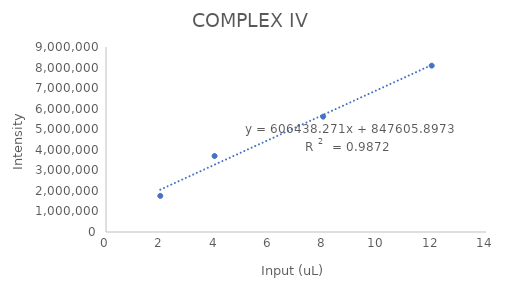
| Category | Series 0 |
|---|---|
| 8.0 | 5610845.841 |
| 4.0 | 3697105.143 |
| 2.0 | 1756792 |
| 12.0 | 8093075.652 |